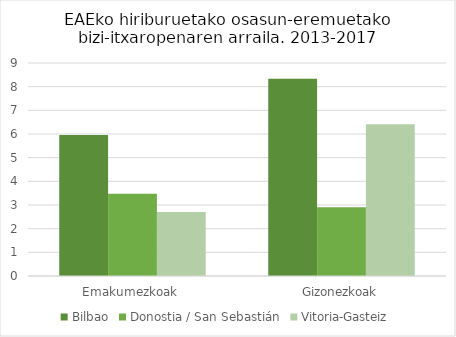
| Category | Bilbao | Donostia / San Sebastián | Vitoria-Gasteiz |
|---|---|---|---|
| Emakumezkoak | 5.96 | 3.48 | 2.7 |
| Gizonezkoak | 8.33 | 2.9 | 6.41 |